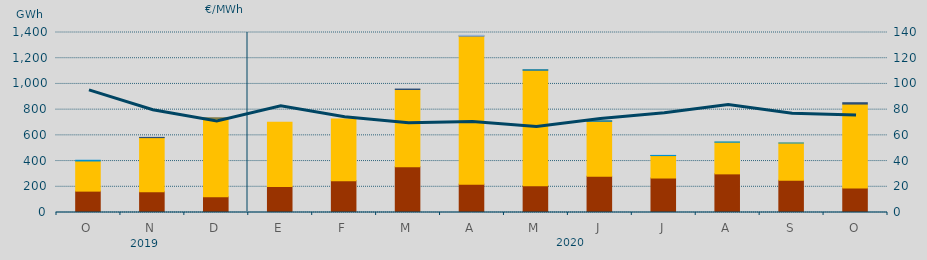
| Category | Carbón | Ciclo Combinado | Consumo Bombeo | Hidráulica | Otras Renovables | Turbinación bombeo |
|---|---|---|---|---|---|---|
| O | 166180 | 234526.2 | 0 | 5517.1 | 0 | 0 |
| N | 161365 | 421030.7 | 0 | 0 | 1775.2 | 0 |
| D | 122168 | 612250.1 | 0 | 0 | 164.2 | 0 |
| E | 202940 | 498564 | 0 | 0 | 0 | 0 |
| F | 247227 | 479450.3 | 0 | 0 | 0 | 0 |
| M | 355297 | 601360.3 | 3495.6 | 0 | 0 | 0 |
| A | 220571 | 1152051.4 | 585 | 0 | 0 | 5000 |
| M | 207721 | 900435.9 | 185 | 630 | 0 | 0 |
| J | 281442 | 429259.5 | 370 | 680 | 0 | 0 |
| J | 268136 | 174851.8 | 11.5 | 1020 | 0 | 0 |
| A | 300478 | 246096.4 | 0 | 2161.8 | 0 | 0 |
| S | 250957 | 289538.3 | 0 | 33.4 | 0 | 0 |
| O | 189825 | 653476.1 | 10686 | 0 | 0 | 0 |